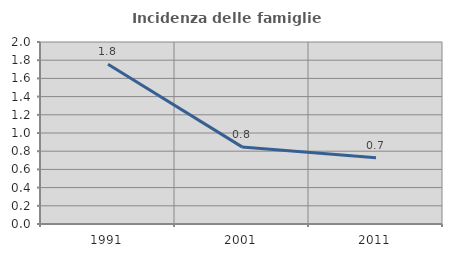
| Category | Incidenza delle famiglie numerose |
|---|---|
| 1991.0 | 1.756 |
| 2001.0 | 0.847 |
| 2011.0 | 0.728 |